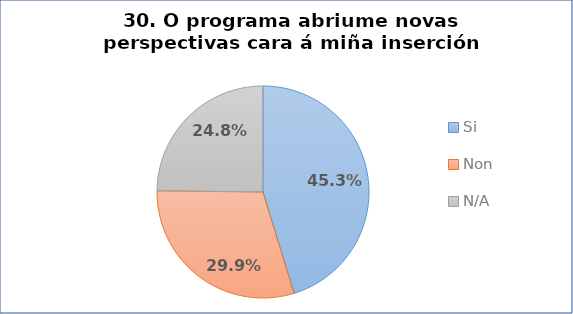
| Category | Pregunta 30. O programa abriume novas perspectivas cara á miña inserción laboral |
|---|---|
| Si | 0.453 |
| Non | 0.299 |
| N/A | 0.248 |